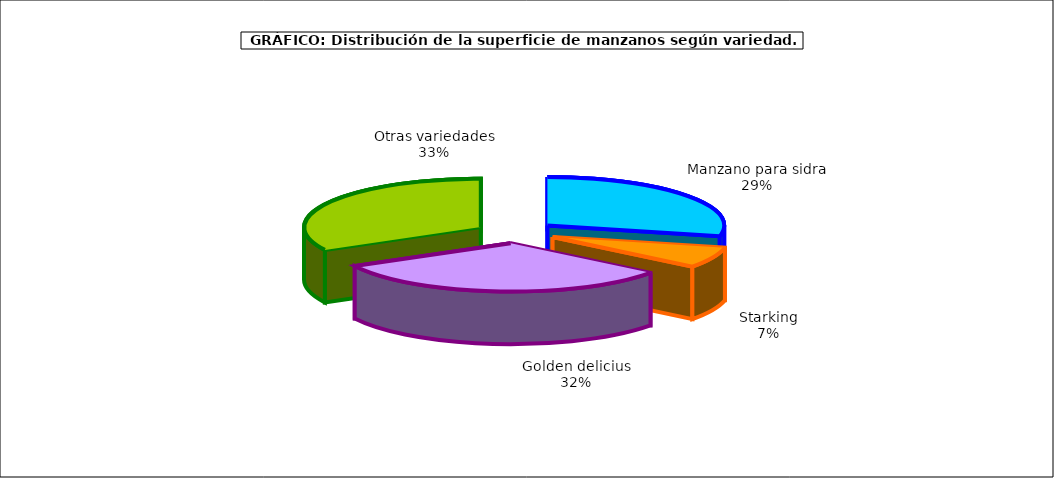
| Category | superficie |
|---|---|
| 0 | 8.356 |
| 1 | 2.023 |
| 2 | 9.272 |
| 3 | 9.595 |